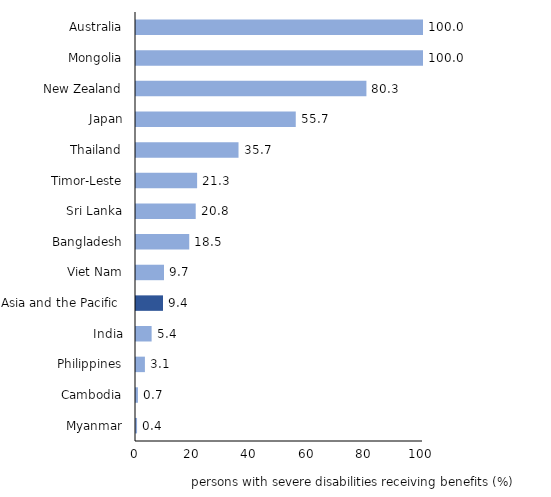
| Category | Series 0 |
|---|---|
| Myanmar | 0.371 |
| Cambodia | 0.676 |
| Philippines | 3.104 |
| India | 5.443 |
| Asia and the Pacific  | 9.4 |
| Viet Nam | 9.75 |
| Bangladesh | 18.548 |
| Sri Lanka | 20.808 |
| Timor-Leste | 21.293 |
| Thailand | 35.72 |
| Japan | 55.667 |
| New Zealand | 80.284 |
| Mongolia | 100 |
| Australia | 100 |